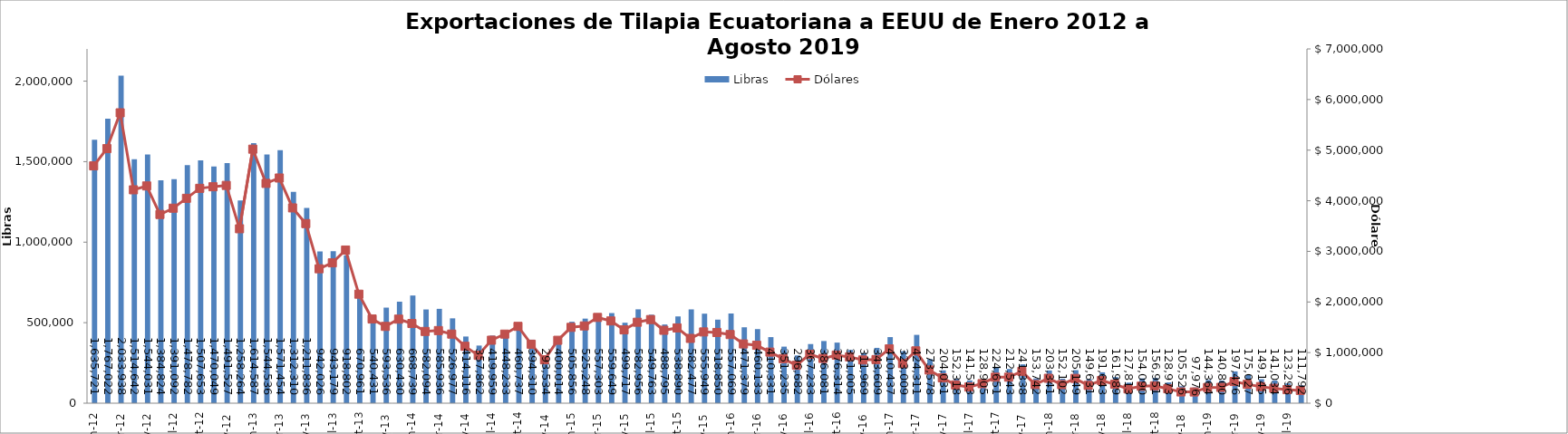
| Category | Libras  |
|---|---|
| 2012-01-01 | 1635720.607 |
| 2012-02-01 | 1767022.174 |
| 2012-03-01 | 2033937.505 |
| 2012-04-01 | 1514641.77 |
| 2012-05-01 | 1544031.293 |
| 2012-06-01 | 1384823.899 |
| 2012-07-01 | 1391091.577 |
| 2012-08-01 | 1478781.747 |
| 2012-09-01 | 1507653.188 |
| 2012-10-01 | 1470049.326 |
| 2012-11-01 | 1491526.539 |
| 2012-12-01 | 1258264 |
| 2013-01-01 | 1614587 |
| 2013-02-01 | 1544536.146 |
| 2013-03-01 | 1571454.312 |
| 2013-04-01 | 1312310.196 |
| 2013-05-01 | 1211835.551 |
| 2013-06-01 | 942025.58 |
| 2013-07-01 | 943178.586 |
| 2013-08-01 | 918802.324 |
| 2013-09-01 | 670961.192 |
| 2013-10-01 | 540431.235 |
| 2013-11-01 | 593535.64 |
| 2013-12-01 | 630429.621 |
| 2014-01-01 | 668739 |
| 2014-02-01 | 582093.766 |
| 2014-03-01 | 585936.383 |
| 2014-04-01 | 526976.561 |
| 2014-05-01 | 414116.473 |
| 2014-06-01 | 357861.695 |
| 2014-07-01 | 419958.663 |
| 2014-08-01 | 448233 |
| 2014-09-01 | 460737.149 |
| 2014-10-01 | 394310.347 |
| 2014-11-01 | 293533.672 |
| 2014-12-01 | 400013.647 |
| 2015-01-01 | 505856.493 |
| 2015-02-01 | 525248 |
| 2015-03-01 | 557303.039 |
| 2015-04-01 | 559648.733 |
| 2015-05-01 | 499716.682 |
| 2015-06-01 | 582955.764 |
| 2015-07-01 | 549763.307 |
| 2015-08-01 | 488795.094 |
| 2015-09-01 | 538890.219 |
| 2015-10-01 | 582477.366 |
| 2015-11-01 | 555949.414 |
| 2015-12-01 | 518850.405 |
| 2016-01-01 | 557069.351 |
| 2016-02-01 | 471378.754 |
| 2016-03-01 | 460133.089 |
| 2016-04-01 | 410331.175 |
| 2016-05-01 | 351235 |
| 2016-06-01 | 296682 |
| 2016-07-01 | 367233.45 |
| 2016-08-01 | 386080.575 |
| 2016-09-01 | 376314.197 |
| 2016-10-01 | 331005.258 |
| 2016-11-01 | 311968.537 |
| 2016-12-01 | 343608.956 |
| 2017-01-01 | 410436.996 |
| 2017-02-01 | 323009.174 |
| 2017-03-01 | 424310.544 |
| 2017-04-01 | 273577.632 |
| 2017-05-01 | 204031.321 |
| 2017-06-01 | 152318.019 |
| 2017-07-01 | 141513.274 |
| 2017-08-01 | 128905.167 |
| 2017-09-01 | 224650.945 |
| 2017-10-01 | 212543.281 |
| 2017-11-01 | 241337.562 |
| 2017-12-01 | 153742.19 |
| 2018-01-01 | 203341.281 |
| 2018-02-01 | 152101.968 |
| 2018-03-01 | 205149.053 |
| 2018-04-01 | 149630.611 |
| 2018-05-01 | 191643 |
| 2018-06-01 | 161989 |
| 2018-07-01 | 127813 |
| 2018-08-01 | 154089.894 |
| 2018-09-01 | 156951.494 |
| 2018-10-01 | 128972.628 |
| 2018-11-01 | 105526.466 |
| 2018-12-01 | 97975.634 |
| 2019-01-01 | 144364.157 |
| 2019-02-01 | 140800 |
| 2019-03-01 | 197476 |
| 2019-04-01 | 175027.19 |
| 2019-05-01 | 149144.92 |
| 2019-06-01 | 141034.12 |
| 2019-07-01 | 123295.72 |
| 2019-08-01 | 111792 |